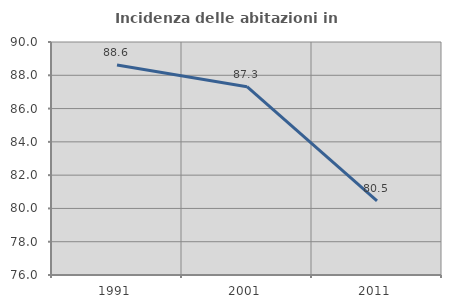
| Category | Incidenza delle abitazioni in proprietà  |
|---|---|
| 1991.0 | 88.618 |
| 2001.0 | 87.313 |
| 2011.0 | 80.451 |